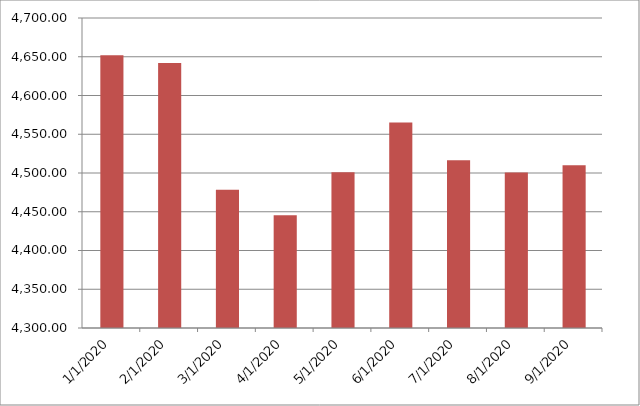
| Category | Series 0 | Series 1 |
|---|---|---|
| 1/1/20 |  | 4651.85 |
| 2/1/20 |  | 4641.93 |
| 3/1/20 |  | 4478.5 |
| 4/1/20 |  | 4445.34 |
| 5/1/20 |  | 4500.94 |
| 6/1/20 |  | 4565.01 |
| 7/1/20 |  | 4516.59 |
| 8/1/20 |  | 4500.61 |
| 9/1/20 |  | 4509.91 |